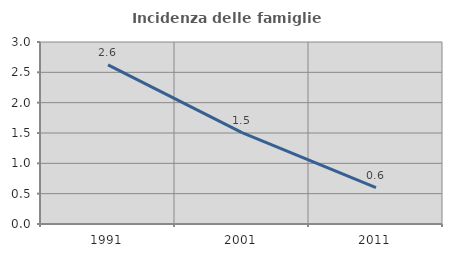
| Category | Incidenza delle famiglie numerose |
|---|---|
| 1991.0 | 2.622 |
| 2001.0 | 1.507 |
| 2011.0 | 0.599 |